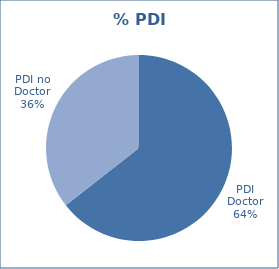
| Category | Series 0 |
|---|---|
| PDI Doctor | 1644 |
| PDI no Doctor | 908 |